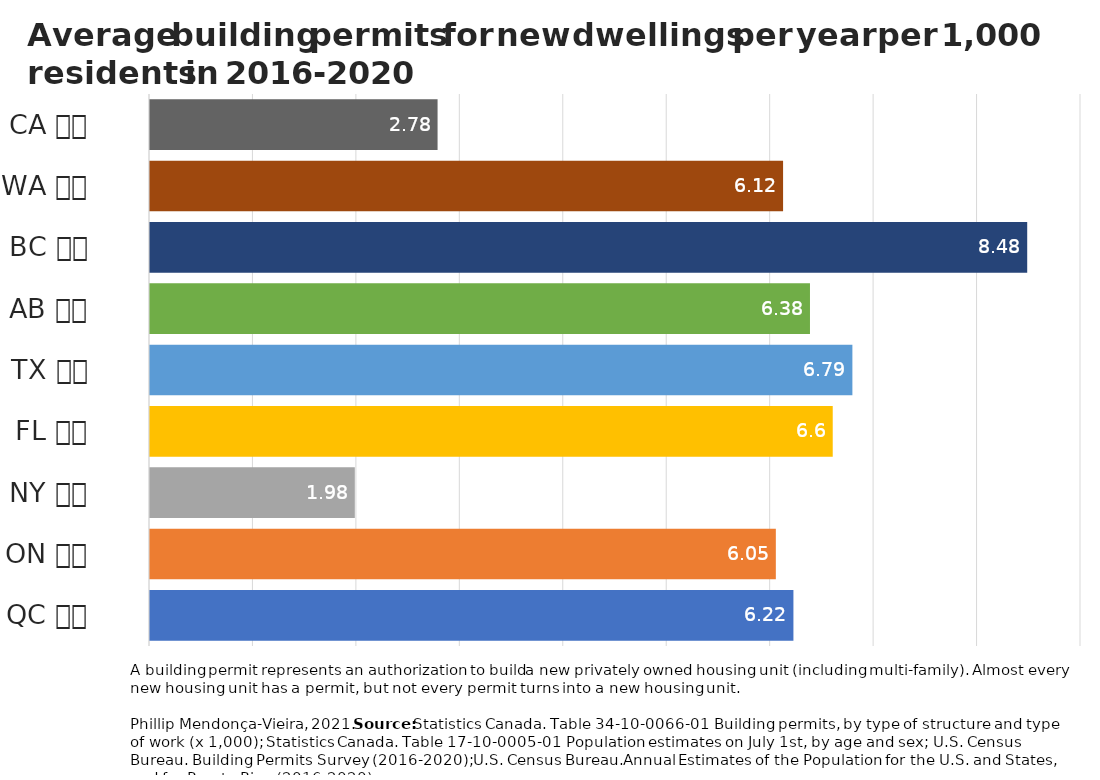
| Category | Average building permits per 1,000 residents 2011-2020 |
|---|---|
| QC 🇨🇦 | 6.22 |
| ON 🇨🇦 | 6.05 |
| NY 🇺🇸 | 1.98 |
| FL 🇺🇸 | 6.6 |
| TX 🇺🇸 | 6.79 |
| AB 🇨🇦 | 6.38 |
| BC 🇨🇦 | 8.48 |
| WA 🇺🇸 | 6.12 |
| CA 🇺🇸 | 2.78 |